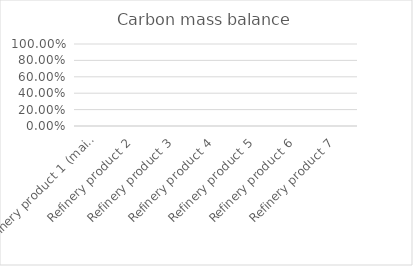
| Category | Series 0 | Series 1 | #DIV/0! |
|---|---|---|---|
| Refinery product 1 (main) | 0 | 0 | 0 |
| Refinery product 2 | 0 | 0 | 0 |
| Refinery product 3 | 0 | 0 | 0 |
| Refinery product 4 | 0 | 0 | 0 |
| Refinery product 5 | 0 | 0 | 0 |
| Refinery product 6 | 0 | 0 | 0 |
| Refinery product 7 | 0 | 0 | 0 |